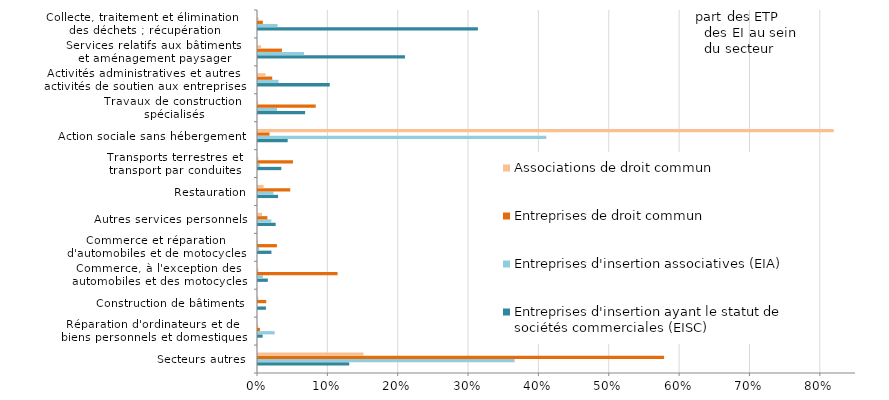
| Category | Entreprises d'insertion ayant le statut de sociétés commerciales (EISC) | Entreprises d'insertion associatives (EIA) | Entreprises de droit commun | Associations de droit commun |
|---|---|---|---|---|
| Secteurs autres | 0.13 | 0.365 | 0.577 | 0.15 |
| Réparation d'ordinateurs et de 
biens personnels et domestiques | 0.007 | 0.024 | 0.003 | 0 |
| Construction de bâtiments | 0.011 | 0 | 0.012 | 0 |
| Commerce, à l'exception des 
automobiles et des motocycles | 0.014 | 0.007 | 0.113 | 0.001 |
| Commerce et réparation 
d'automobiles et de motocycles | 0.019 | 0.002 | 0.027 | 0 |
| Autres services personnels | 0.025 | 0.019 | 0.013 | 0.006 |
| Restauration | 0.029 | 0.022 | 0.046 | 0.008 |
| Transports terrestres et 
transport par conduites | 0.033 | 0.003 | 0.05 | 0.001 |
| Action sociale sans hébergement | 0.042 | 0.41 | 0.016 | 0.818 |
| Travaux de construction 
spécialisés | 0.067 | 0.027 | 0.082 | 0 |
| Activités administratives et autres 
activités de soutien aux entreprises | 0.102 | 0.029 | 0.02 | 0.011 |
| Services relatifs aux bâtiments 
et aménagement paysager | 0.209 | 0.065 | 0.034 | 0.004 |
| Collecte, traitement et élimination 
des déchets ; récupération | 0.313 | 0.028 | 0.007 | 0.001 |